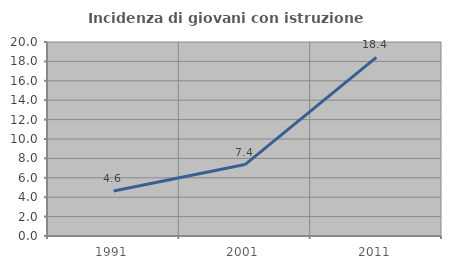
| Category | Incidenza di giovani con istruzione universitaria |
|---|---|
| 1991.0 | 4.636 |
| 2001.0 | 7.362 |
| 2011.0 | 18.421 |